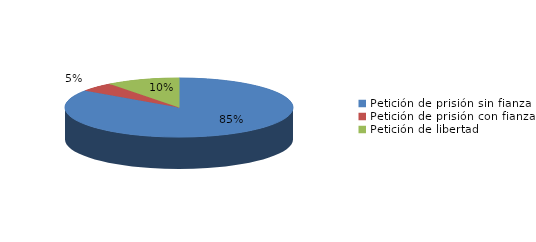
| Category | Series 0 |
|---|---|
| Petición de prisión sin fianza | 155 |
| Petición de prisión con fianza | 9 |
| Petición de libertad | 19 |